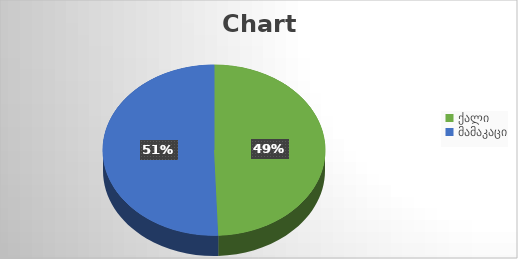
| Category | Series 0 |
|---|---|
| ქალი | 1847 |
| მამაკაცი | 1892 |